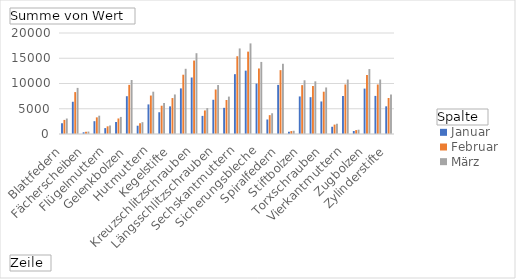
| Category | Januar | Februar | März |
|---|---|---|---|
| Blattfedern | 2145 | 2788.5 | 3067.35 |
| Druckfedern | 6384 | 8299.2 | 9129.12 |
| Fächerscheiben | 338 | 439.4 | 483.34 |
| Federscheiben | 2535 | 3295.5 | 3625.05 |
| Flügelmuttern | 1167 | 1517.1 | 1668.81 |
| Flügelschrauben | 2366 | 3075.8 | 3383.38 |
| Gelenkbolzen | 7482 | 9726.6 | 10699.26 |
| Gleitlager | 1639 | 2130.7 | 2343.77 |
| Hutmuttern | 5859 | 7616.7 | 8378.37 |
| Inbusschrauben | 4308 | 5600.4 | 6160.44 |
| Kegelstifte | 5475 | 7117.5 | 7829.25 |
| Kopfbolzen | 9030 | 11739 | 12912.9 |
| Kreuzschlitzschrauben | 11187 | 14543.1 | 15997.41 |
| Kronenmuttern | 3588 | 4664.4 | 5130.84 |
| Längsschlitzschrauben | 6780 | 8814 | 9695.4 |
| Nutmuttern | 5180 | 6734 | 7407.4 |
| Sechskantmuttern | 11847 | 15401.1 | 16941.21 |
| Sechskantschrauben | 12546 | 16309.8 | 17940.78 |
| Sicherungsbleche | 9980 | 12974 | 14271.4 |
| Spannscheiben | 2873 | 3734.9 | 4108.39 |
| Spiralfedern | 9725 | 12642.5 | 13906.75 |
| Splinte | 447 | 581.1 | 639.21 |
| Stiftbolzen | 7440 | 9672 | 10639.2 |
| Tellerfedern | 7293 | 9480.9 | 10428.99 |
| Torxschrauben | 6443 | 8375.9 | 9213.49 |
| Unterlegscheiben | 1432 | 1861.6 | 2047.76 |
| Vierkantmuttern | 7542 | 9804.6 | 10785.06 |
| Wälzlager | 596 | 774.8 | 852.28 |
| Zugbolzen | 8991 | 11688.3 | 12857.13 |
| Zugfedern | 7542 | 9804.6 | 10785.06 |
| Zylinderstifte | 5481 | 7125.3 | 7837.83 |